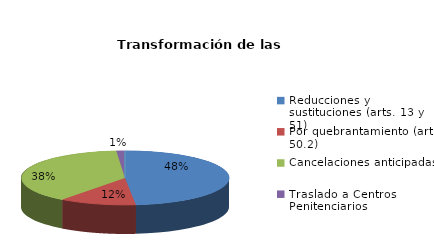
| Category | Series 0 |
|---|---|
| Reducciones y sustituciones (arts. 13 y 51) | 73 |
| Por quebrantamiento (art. 50.2) | 18 |
| Cancelaciones anticipadas | 58 |
| Traslado a Centros Penitenciarios | 2 |
| Conversión internamientos en cerrados (art. 51.2) | 0 |